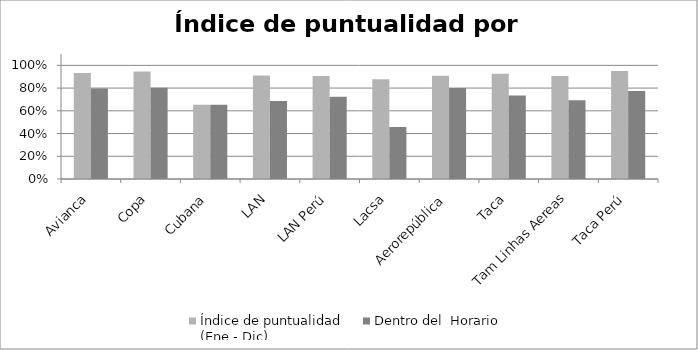
| Category | Índice de puntualidad
(Ene - Dic) | Dentro del  Horario |
|---|---|---|
| Avianca | 0.934 | 0.797 |
| Copa | 0.946 | 0.802 |
| Cubana | 0.654 | 0.654 |
| LAN | 0.911 | 0.687 |
| LAN Perú | 0.906 | 0.725 |
| Lacsa | 0.878 | 0.457 |
| Aerorepública | 0.909 | 0.8 |
| Taca | 0.925 | 0.735 |
| Tam Linhas Aereas | 0.906 | 0.693 |
| Taca Perú | 0.949 | 0.774 |